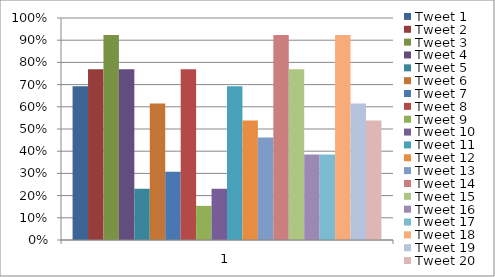
| Category | Tweet 1 | Tweet 2 | Tweet 3 | Tweet 4 | Tweet 5 | Tweet 6 | Tweet 7 | Tweet 8 | Tweet 9 | Tweet 10 | Tweet 11 | Tweet 12 | Tweet 13 | Tweet 14 | Tweet 15 | Tweet 16 | Tweet 17 | Tweet 18 | Tweet 19 | Tweet 20 |
|---|---|---|---|---|---|---|---|---|---|---|---|---|---|---|---|---|---|---|---|---|
| 0 | 0.692 | 0.769 | 0.923 | 0.769 | 0.231 | 0.615 | 0.308 | 0.769 | 0.154 | 0.231 | 0.692 | 0.538 | 0.462 | 0.923 | 0.769 | 0.385 | 0.385 | 0.923 | 0.615 | 0.538 |